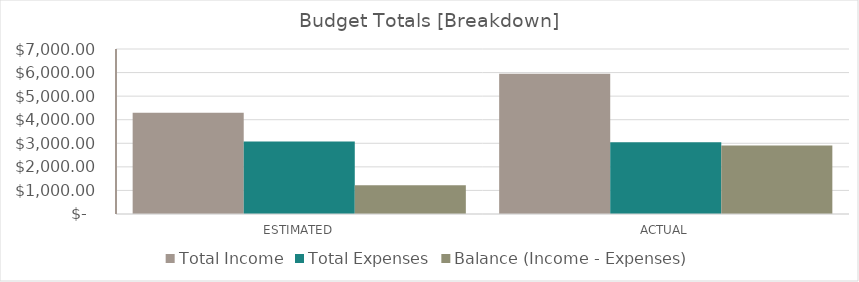
| Category | Total Income | Total Expenses | Balance (Income - Expenses) |
|---|---|---|---|
| ESTIMATED | 4300 | 3080 | 1220 |
| ACTUAL | 5950 | 3047 | 2903 |